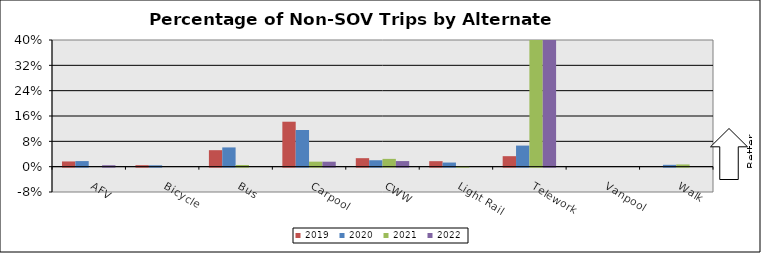
| Category | 2019 | 2020 | 2021 | 2022 |
|---|---|---|---|---|
| AFV | 0.016 | 0.018 | 0 | 0.005 |
| Bicycle | 0.005 | 0.004 | 0 | 0 |
| Bus | 0.052 | 0.061 | 0.005 | 0 |
| Carpool | 0.142 | 0.116 | 0.016 | 0.016 |
| CWW | 0.027 | 0.02 | 0.025 | 0.018 |
| Light Rail | 0.017 | 0.013 | 0.002 | 0 |
| Telework | 0.033 | 0.067 | 0.819 | 0.818 |
| Vanpool | 0 | 0 | 0 | 0 |
| Walk | 0 | 0.006 | 0.007 | 0 |